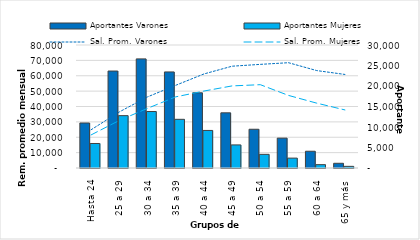
| Category | Aportantes Varones | Aportantes Mujeres |
|---|---|---|
| 0 | 10978 | 5976 |
| 1 | 23648 | 12768 |
| 2 | 26613 | 13776 |
| 3 | 23432 | 11873 |
| 4 | 18343 | 9159 |
| 5 | 13460 | 5631 |
| 6 | 9450 | 3329 |
| 7 | 7283 | 2412 |
| 8 | 4087 | 817 |
| 9 | 1148 | 401 |